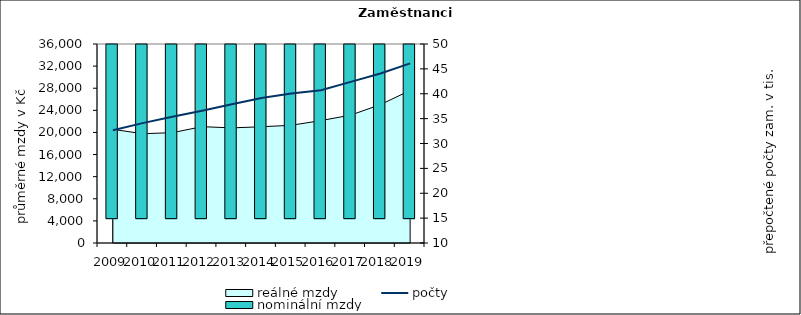
| Category | nominální mzdy  |
|---|---|
| 2009.0 | 18856.605 |
| 2010.0 | 18386.08 |
| 2011.0 | 18918.549 |
| 2012.0 | 20603.759 |
| 2013.0 | 20678.761 |
| 2014.0 | 20966.004 |
| 2015.0 | 21297.714 |
| 2016.0 | 22300.279 |
| 2017.0 | 23852.172 |
| 2018.0 | 26359.8 |
| 2019.0 | 29884.629 |